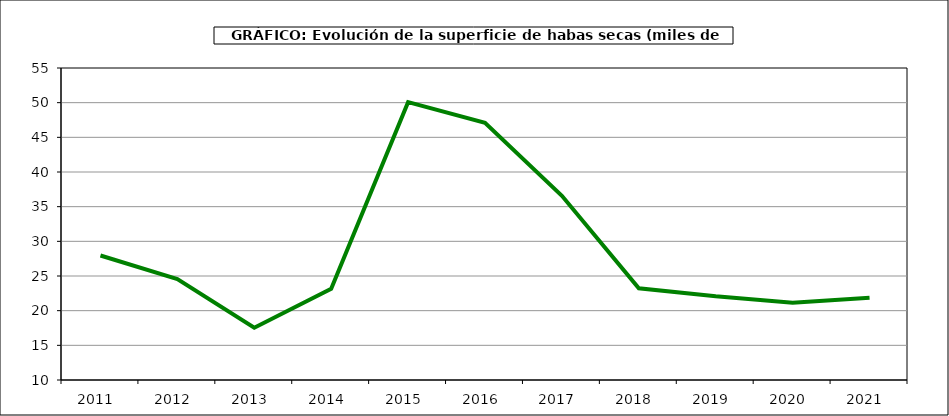
| Category | Superficie |
|---|---|
| 2011.0 | 27.957 |
| 2012.0 | 24.564 |
| 2013.0 | 17.542 |
| 2014.0 | 23.165 |
| 2015.0 | 50.072 |
| 2016.0 | 47.109 |
| 2017.0 | 36.574 |
| 2018.0 | 23.234 |
| 2019.0 | 22.065 |
| 2020.0 | 21.146 |
| 2021.0 | 21.871 |